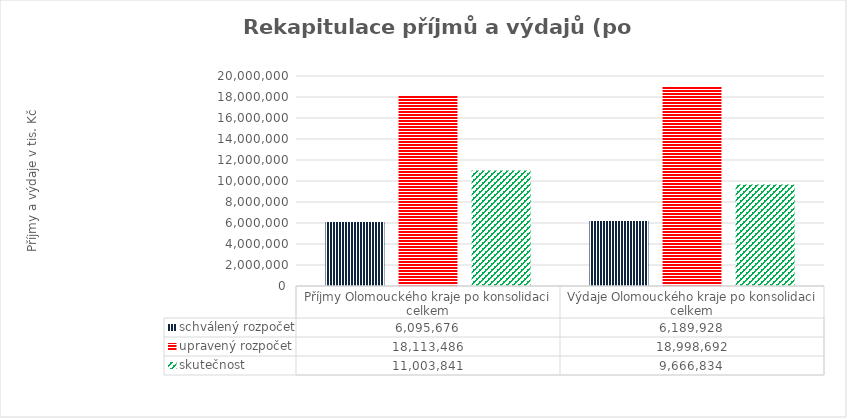
| Category | schválený rozpočet | upravený rozpočet | skutečnost |
|---|---|---|---|
| Příjmy Olomouckého kraje po konsolidaci celkem | 6095676 | 18113486 | 11003841 |
| Výdaje Olomouckého kraje po konsolidaci celkem | 6189928 | 18998692 | 9666834 |